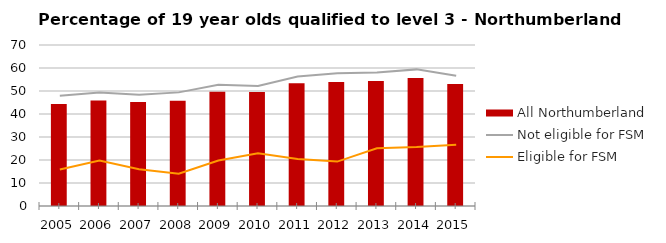
| Category | All Northumberland |
|---|---|
| 2005.0 | 44.4 |
| 2006.0 | 45.9 |
| 2007.0 | 45.2 |
| 2008.0 | 45.8 |
| 2009.0 | 49.7 |
| 2010.0 | 49.6 |
| 2011.0 | 53.4 |
| 2012.0 | 53.9 |
| 2013.0 | 54.3 |
| 2014.0 | 55.7 |
| 2015.0 | 53 |